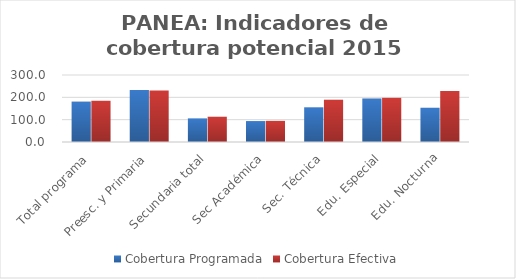
| Category | Cobertura Programada | Cobertura Efectiva |
|---|---|---|
| Total programa | 180.691 | 184.53 |
| Preesc. y Primaria | 232.982 | 230.951 |
| Secundaria total | 105.791 | 113.077 |
| Sec Académica | 93.736 | 94.549 |
| Sec. Técnica | 155.377 | 189.289 |
| Edu. Especial | 194.625 | 197.654 |
| Edu. Nocturna | 153.258 | 228.341 |